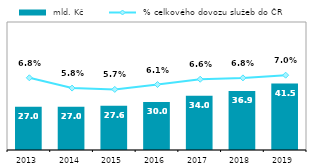
| Category |  mld. Kč |
|---|---|
| 2013.0 | 27.011 |
| 2014.0 | 27.005 |
| 2015.0 | 27.615 |
| 2016.0 | 30.003 |
| 2017.0 | 33.956 |
| 2018.0 | 36.888 |
| 2019.0 | 41.504 |